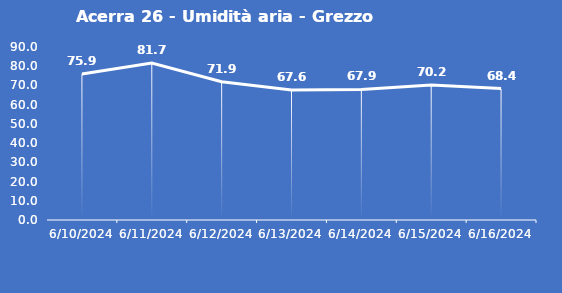
| Category | Acerra 26 - Umidità aria - Grezzo (%) |
|---|---|
| 6/10/24 | 75.9 |
| 6/11/24 | 81.7 |
| 6/12/24 | 71.9 |
| 6/13/24 | 67.6 |
| 6/14/24 | 67.9 |
| 6/15/24 | 70.2 |
| 6/16/24 | 68.4 |